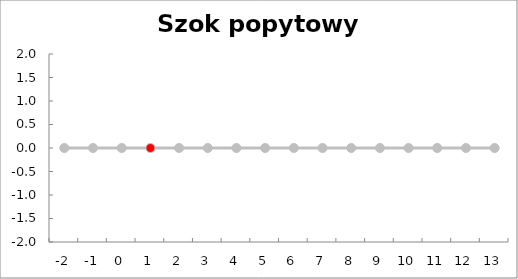
| Category | Series 1 | Szok popytowy ε |
|---|---|---|
| -2.0 | 0 | 0 |
| -1.0 | 0 | 0 |
| 0.0 | 0 | 0 |
| 1.0 | 0 | 0 |
| 2.0 | 0 | 0 |
| 3.0 | 0 | 0 |
| 4.0 | 0 | 0 |
| 5.0 | 0 | 0 |
| 6.0 | 0 | 0 |
| 7.0 | 0 | 0 |
| 8.0 | 0 | 0 |
| 9.0 | 0 | 0 |
| 10.0 | 0 | 0 |
| 11.0 | 0 | 0 |
| 12.0 | 0 | 0 |
| 13.0 | 0 | 0 |